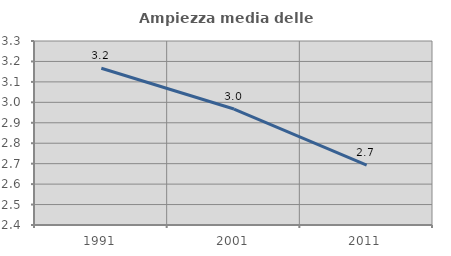
| Category | Ampiezza media delle famiglie |
|---|---|
| 1991.0 | 3.167 |
| 2001.0 | 2.967 |
| 2011.0 | 2.693 |